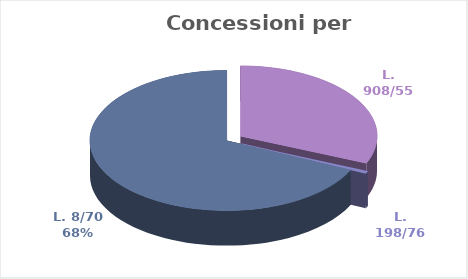
| Category | Series 0 |
|---|---|
| L. 908/55 | 36029500 |
| L. 198/76 | 637500 |
| L. 8/70 | 78289265 |